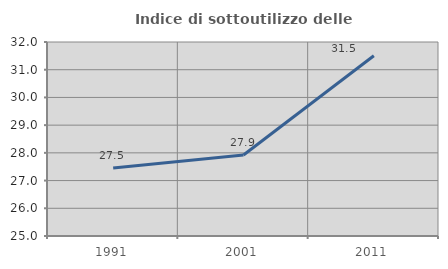
| Category | Indice di sottoutilizzo delle abitazioni  |
|---|---|
| 1991.0 | 27.451 |
| 2001.0 | 27.925 |
| 2011.0 | 31.504 |